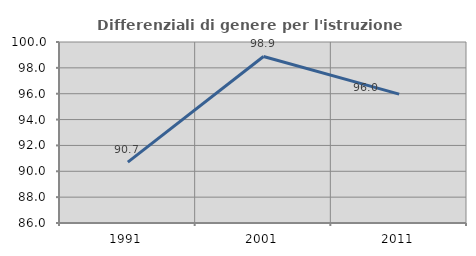
| Category | Differenziali di genere per l'istruzione superiore |
|---|---|
| 1991.0 | 90.707 |
| 2001.0 | 98.881 |
| 2011.0 | 95.967 |